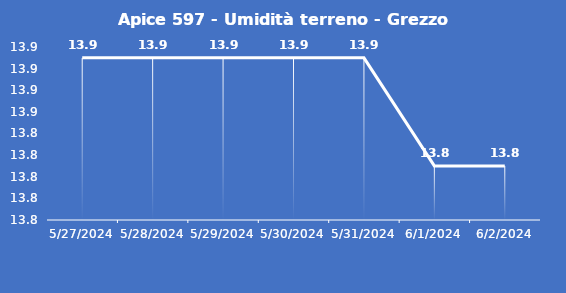
| Category | Apice 597 - Umidità terreno - Grezzo (%VWC) |
|---|---|
| 5/27/24 | 13.9 |
| 5/28/24 | 13.9 |
| 5/29/24 | 13.9 |
| 5/30/24 | 13.9 |
| 5/31/24 | 13.9 |
| 6/1/24 | 13.8 |
| 6/2/24 | 13.8 |